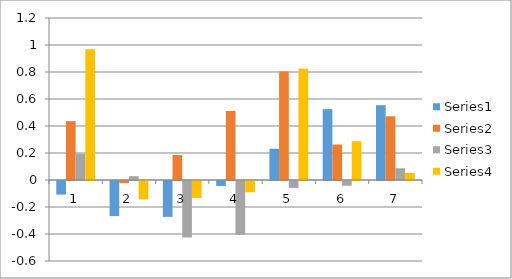
| Category | Series 0 | Series 1 | Series 2 | Series 3 |
|---|---|---|---|---|
| 0 | -0.1 | 0.436 | 0.194 | 0.969 |
| 1 | -0.26 | -0.016 | 0.029 | -0.136 |
| 2 | -0.266 | 0.185 | -0.418 | -0.126 |
| 3 | -0.036 | 0.512 | -0.398 | -0.084 |
| 4 | 0.231 | 0.803 | -0.051 | 0.826 |
| 5 | 0.525 | 0.263 | -0.035 | 0.288 |
| 6 | 0.554 | 0.472 | 0.087 | 0.053 |